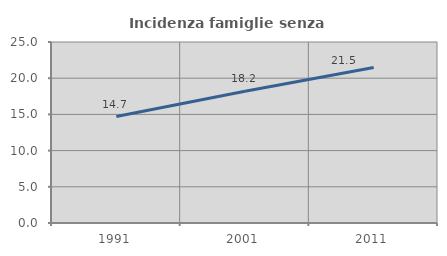
| Category | Incidenza famiglie senza nuclei |
|---|---|
| 1991.0 | 14.699 |
| 2001.0 | 18.187 |
| 2011.0 | 21.485 |